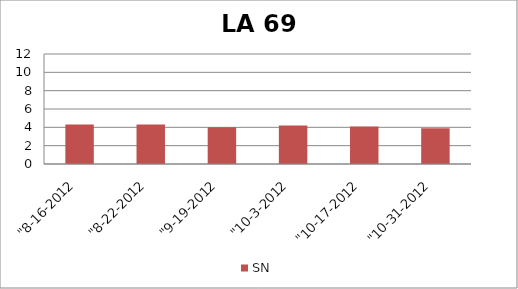
| Category | SN |
|---|---|
| "8-16-2012 | 4.3 |
| "8-22-2012 | 4.3 |
| "9-19-2012 | 4 |
| "10-3-2012 | 4.2 |
| "10-17-2012 | 4.1 |
| "10-31-2012 | 3.9 |